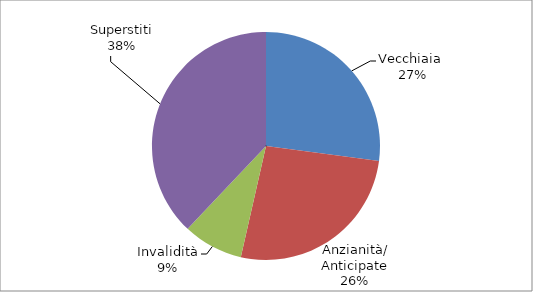
| Category | Series 0 |
|---|---|
| Vecchiaia  | 3191 |
| Anzianità/ Anticipate | 3114 |
| Invalidità | 1002 |
| Superstiti | 4467 |